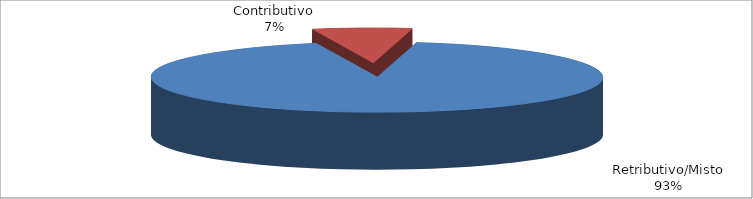
| Category | Decorrenti ANNO 2022 |
|---|---|
| Retributivo/Misto | 68271 |
| Contributivo | 5232 |